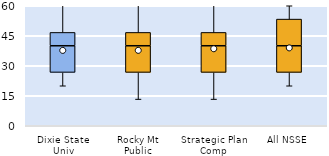
| Category | 25th | 50th | 75th |
|---|---|---|---|
| Dixie State Univ | 26.667 | 13.333 | 6.667 |
| Rocky Mt Public | 26.667 | 13.333 | 6.667 |
| Strategic Plan Comp | 26.667 | 13.333 | 6.667 |
| All NSSE | 26.667 | 13.333 | 13.333 |